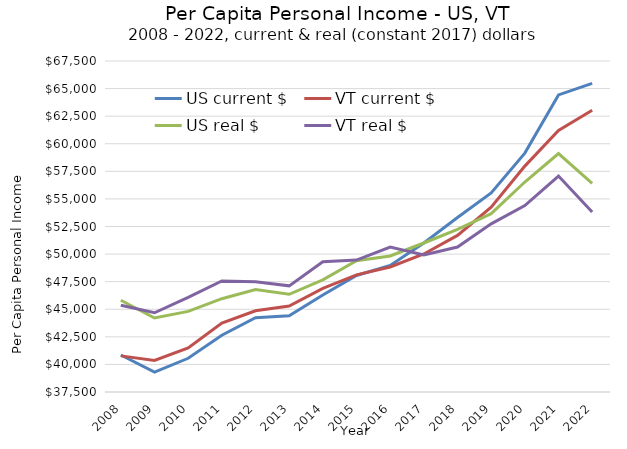
| Category | US current $ | VT current $ | US real $ | VT real $ |
|---|---|---|---|---|
| 2022 | 65473 | 63035 | 56419 | 53806 |
| 2021 | 64427 | 61202 | 59110 | 57077 |
| 2020 | 59151 | 57974 | 56533 | 54402 |
| 2019 | 55547 | 54257 | 53662 | 52739 |
| 2018 | 53309 | 51692 | 52240 | 50638 |
| 2017 | 51004 | 50011 | 51004 | 49930 |
| 2016 | 48971 | 48831 | 49826 | 50635 |
| 2015 | 48060 | 48120 | 49394 | 49460 |
| 2014 | 46287 | 46897 | 47659 | 49298 |
| 2013 | 44401 | 45298 | 46357 | 47120 |
| 2012 | 44237 | 44861 | 46795 | 47494 |
| 2011 | 42649 | 43756 | 45956 | 47570 |
| 2010 | 40557 | 41492 | 44808 | 46082 |
| 2009 | 39307 | 40358 | 44204 | 44683 |
| 2008 | 40854 | 40774 | 45816 | 45363 |